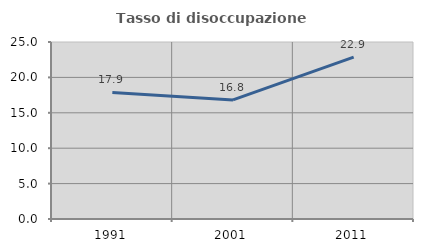
| Category | Tasso di disoccupazione giovanile  |
|---|---|
| 1991.0 | 17.881 |
| 2001.0 | 16.818 |
| 2011.0 | 22.857 |